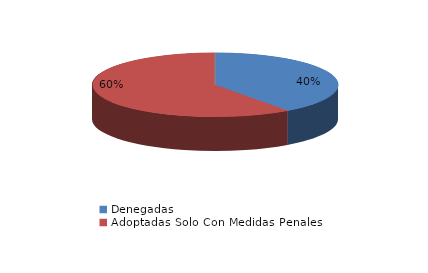
| Category | Series 0 |
|---|---|
| Denegadas | 22 |
| Adoptadas Solo Con Medidas Penales | 33 |
| Adoptadas Con Medidas Civiles Y Penales | 0 |
| Adoptadas Con Medidas Solo Civiles | 0 |